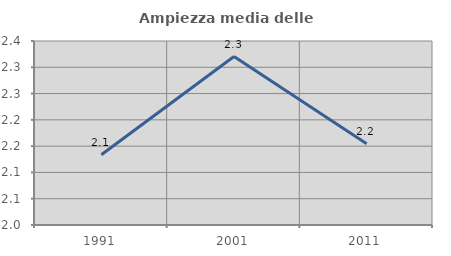
| Category | Ampiezza media delle famiglie |
|---|---|
| 1991.0 | 2.134 |
| 2001.0 | 2.32 |
| 2011.0 | 2.155 |